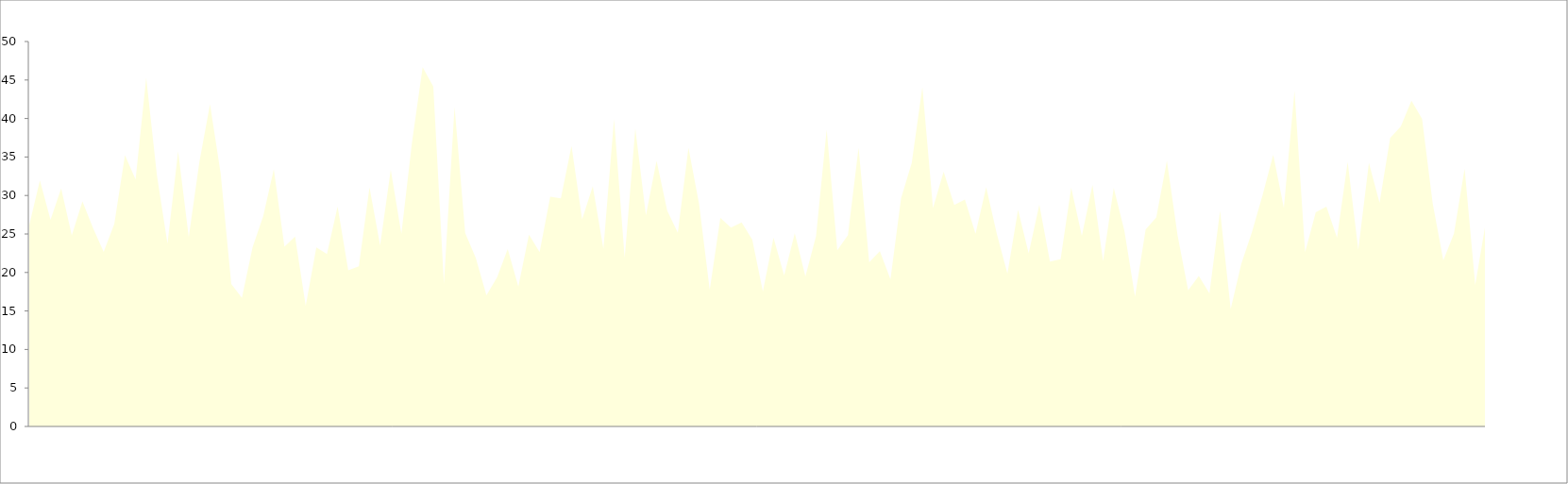
| Category | Series 0 |
|---|---|
| 0 | 26.15 |
| 1/1/00 | 31.95 |
| 1/2/00 | 26.83 |
| 1/3/00 | 30.92 |
| 1/4/00 | 24.82 |
| 1/5/00 | 29.22 |
| 1/6/00 | 25.77 |
| 1/7/00 | 22.67 |
| 1/8/00 | 26.32 |
| 1/9/00 | 35.23 |
| 1/10/00 | 32.09 |
| 1/11/00 | 45.27 |
| 1/12/00 | 32.68 |
| 1/13/00 | 23.75 |
| 1/14/00 | 35.72 |
| 1/15/00 | 24.61 |
| 1/16/00 | 34.33 |
| 1/17/00 | 41.86 |
| 1/18/00 | 32.86 |
| 1/19/00 | 18.52 |
| 1/20/00 | 16.7 |
| 1/21/00 | 23.26 |
| 1/22/00 | 27.31 |
| 1/23/00 | 33.39 |
| 1/24/00 | 23.35 |
| 1/25/00 | 24.66 |
| 1/26/00 | 15.66 |
| 1/27/00 | 23.24 |
| 1/28/00 | 22.4 |
| 1/29/00 | 28.55 |
| 1/30/00 | 20.29 |
| 1/31/00 | 20.8 |
| 2/1/00 | 31.04 |
| 2/2/00 | 23.53 |
| 2/3/00 | 33.32 |
| 2/4/00 | 25.04 |
| 2/5/00 | 36.92 |
| 2/6/00 | 46.67 |
| 2/7/00 | 44.15 |
| 2/8/00 | 18.53 |
| 2/9/00 | 41.47 |
| 2/10/00 | 25.13 |
| 2/11/00 | 21.88 |
| 2/12/00 | 17.04 |
| 2/13/00 | 19.35 |
| 2/14/00 | 23.04 |
| 2/15/00 | 18.17 |
| 2/16/00 | 24.92 |
| 2/17/00 | 22.63 |
| 2/18/00 | 29.84 |
| 2/19/00 | 29.63 |
| 2/20/00 | 36.42 |
| 2/21/00 | 26.91 |
| 2/22/00 | 31.2 |
| 2/23/00 | 23.06 |
| 2/24/00 | 39.91 |
| 2/25/00 | 21.86 |
| 2/26/00 | 38.71 |
| 2/27/00 | 27.42 |
| 2/28/00 | 34.5 |
| 2/28/00 | 28.04 |
| 3/1/00 | 25.16 |
| 3/2/00 | 36.17 |
| 3/3/00 | 28.89 |
| 3/4/00 | 17.74 |
| 3/5/00 | 27.09 |
| 3/6/00 | 25.84 |
| 3/7/00 | 26.5 |
| 3/8/00 | 24.26 |
| 3/9/00 | 17.51 |
| 3/10/00 | 24.52 |
| 3/11/00 | 19.6 |
| 3/12/00 | 25.1 |
| 3/13/00 | 19.48 |
| 3/14/00 | 24.71 |
| 3/15/00 | 38.55 |
| 3/16/00 | 22.9 |
| 3/17/00 | 24.84 |
| 3/18/00 | 36.19 |
| 3/19/00 | 21.33 |
| 3/20/00 | 22.77 |
| 3/21/00 | 19.12 |
| 3/22/00 | 29.66 |
| 3/23/00 | 34.22 |
| 3/24/00 | 44.05 |
| 3/25/00 | 28.38 |
| 3/26/00 | 33.09 |
| 3/27/00 | 28.76 |
| 3/28/00 | 29.47 |
| 3/29/00 | 25.03 |
| 3/30/00 | 31.07 |
| 3/31/00 | 25.04 |
| 4/1/00 | 19.86 |
| 4/2/00 | 28.13 |
| 4/3/00 | 22.49 |
| 4/4/00 | 28.8 |
| 4/5/00 | 21.43 |
| 4/6/00 | 21.71 |
| 4/7/00 | 31.01 |
| 4/8/00 | 24.76 |
| 4/9/00 | 31.38 |
| 4/10/00 | 21.49 |
| 4/11/00 | 30.97 |
| 4/12/00 | 25.42 |
| 4/13/00 | 16.86 |
| 4/14/00 | 25.58 |
| 4/15/00 | 27.13 |
| 4/16/00 | 34.51 |
| 4/17/00 | 24.85 |
| 4/18/00 | 17.69 |
| 4/19/00 | 19.54 |
| 4/20/00 | 17.28 |
| 4/21/00 | 27.99 |
| 4/22/00 | 15.27 |
| 4/23/00 | 21.15 |
| 4/24/00 | 25.26 |
| 4/25/00 | 30.05 |
| 4/26/00 | 35.29 |
| 4/27/00 | 28.37 |
| 4/28/00 | 43.57 |
| 4/29/00 | 22.63 |
| 4/30/00 | 27.83 |
| 5/1/00 | 28.56 |
| 5/2/00 | 24.5 |
| 5/3/00 | 34.34 |
| 5/4/00 | 22.99 |
| 5/5/00 | 34.22 |
| 5/6/00 | 29.04 |
| 5/7/00 | 37.47 |
| 5/8/00 | 38.96 |
| 5/9/00 | 42.32 |
| 5/10/00 | 39.95 |
| 5/11/00 | 28.96 |
| 5/12/00 | 21.56 |
| 5/13/00 | 25.05 |
| 5/14/00 | 33.48 |
| 5/15/00 | 18.37 |
| 5/16/00 | 26.57 |